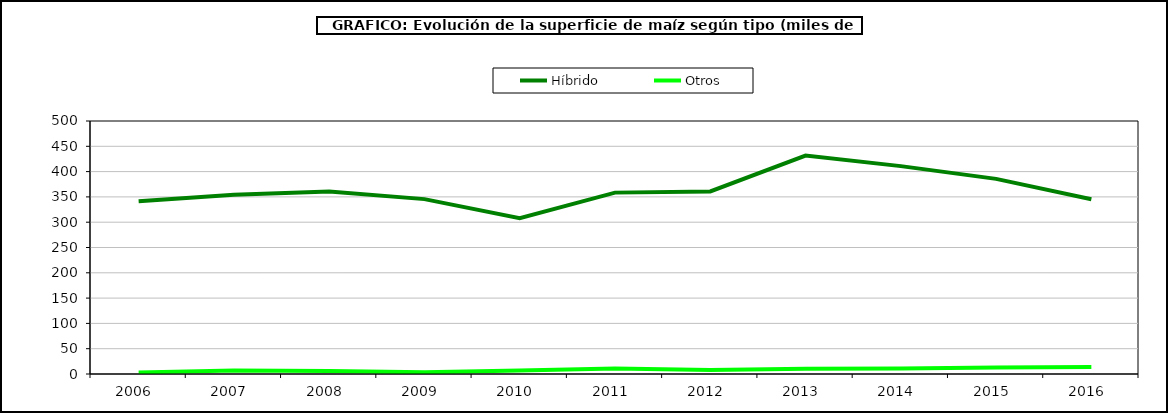
| Category | Híbrido | Otros |
|---|---|---|
| 2006.0 | 341.193 | 3.207 |
| 2007.0 | 354.133 | 6.865 |
| 2008.0 | 360.764 | 5.72 |
| 2009.0 | 345.605 | 3.344 |
| 2010.0 | 307.927 | 7.063 |
| 2011.0 | 358.45 | 10.814 |
| 2012.0 | 360.837 | 7.917 |
| 2013.0 | 431.742 | 10.556 |
| 2014.0 | 410.83 | 10.775 |
| 2015.0 | 385.617 | 12.64 |
| 2016.0 | 345.266 | 14.009 |